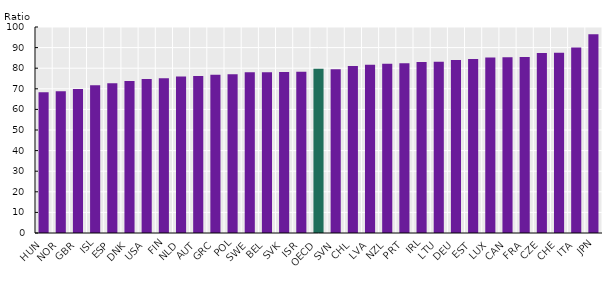
| Category | Mental distress |
|---|---|
| HUN | 68.381 |
| NOR | 68.768 |
| GBR | 69.921 |
| ISL | 71.762 |
| ESP | 72.694 |
| DNK | 73.788 |
| USA | 74.725 |
| FIN | 75.123 |
| NLD | 76.018 |
| AUT | 76.235 |
| GRC | 76.801 |
| POL | 77.043 |
| SWE | 77.982 |
| BEL | 78.001 |
| SVK | 78.193 |
| ISR | 78.223 |
| OECD | 79.761 |
| SVN | 79.472 |
| CHL | 81.128 |
| LVA | 81.693 |
| NZL | 82.112 |
| PRT | 82.35 |
| IRL | 83.041 |
| LTU | 83.084 |
| DEU | 83.979 |
| EST | 84.434 |
| LUX | 85.134 |
| CAN | 85.366 |
| FRA | 85.497 |
| CZE | 87.412 |
| CHE | 87.524 |
| ITA | 90.03 |
| JPN | 96.433 |